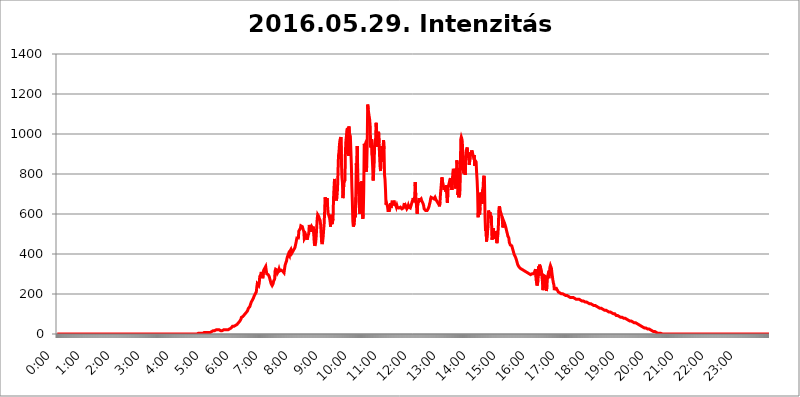
| Category | 2016.05.29. Intenzitás [W/m^2] |
|---|---|
| 0.0 | 0 |
| 0.0006944444444444445 | 0 |
| 0.001388888888888889 | 0 |
| 0.0020833333333333333 | 0 |
| 0.002777777777777778 | 0 |
| 0.003472222222222222 | 0 |
| 0.004166666666666667 | 0 |
| 0.004861111111111111 | 0 |
| 0.005555555555555556 | 0 |
| 0.0062499999999999995 | 0 |
| 0.006944444444444444 | 0 |
| 0.007638888888888889 | 0 |
| 0.008333333333333333 | 0 |
| 0.009027777777777779 | 0 |
| 0.009722222222222222 | 0 |
| 0.010416666666666666 | 0 |
| 0.011111111111111112 | 0 |
| 0.011805555555555555 | 0 |
| 0.012499999999999999 | 0 |
| 0.013194444444444444 | 0 |
| 0.013888888888888888 | 0 |
| 0.014583333333333332 | 0 |
| 0.015277777777777777 | 0 |
| 0.015972222222222224 | 0 |
| 0.016666666666666666 | 0 |
| 0.017361111111111112 | 0 |
| 0.018055555555555557 | 0 |
| 0.01875 | 0 |
| 0.019444444444444445 | 0 |
| 0.02013888888888889 | 0 |
| 0.020833333333333332 | 0 |
| 0.02152777777777778 | 0 |
| 0.022222222222222223 | 0 |
| 0.02291666666666667 | 0 |
| 0.02361111111111111 | 0 |
| 0.024305555555555556 | 0 |
| 0.024999999999999998 | 0 |
| 0.025694444444444447 | 0 |
| 0.02638888888888889 | 0 |
| 0.027083333333333334 | 0 |
| 0.027777777777777776 | 0 |
| 0.02847222222222222 | 0 |
| 0.029166666666666664 | 0 |
| 0.029861111111111113 | 0 |
| 0.030555555555555555 | 0 |
| 0.03125 | 0 |
| 0.03194444444444445 | 0 |
| 0.03263888888888889 | 0 |
| 0.03333333333333333 | 0 |
| 0.034027777777777775 | 0 |
| 0.034722222222222224 | 0 |
| 0.035416666666666666 | 0 |
| 0.036111111111111115 | 0 |
| 0.03680555555555556 | 0 |
| 0.0375 | 0 |
| 0.03819444444444444 | 0 |
| 0.03888888888888889 | 0 |
| 0.03958333333333333 | 0 |
| 0.04027777777777778 | 0 |
| 0.04097222222222222 | 0 |
| 0.041666666666666664 | 0 |
| 0.042361111111111106 | 0 |
| 0.04305555555555556 | 0 |
| 0.043750000000000004 | 0 |
| 0.044444444444444446 | 0 |
| 0.04513888888888889 | 0 |
| 0.04583333333333334 | 0 |
| 0.04652777777777778 | 0 |
| 0.04722222222222222 | 0 |
| 0.04791666666666666 | 0 |
| 0.04861111111111111 | 0 |
| 0.049305555555555554 | 0 |
| 0.049999999999999996 | 0 |
| 0.05069444444444445 | 0 |
| 0.051388888888888894 | 0 |
| 0.052083333333333336 | 0 |
| 0.05277777777777778 | 0 |
| 0.05347222222222222 | 0 |
| 0.05416666666666667 | 0 |
| 0.05486111111111111 | 0 |
| 0.05555555555555555 | 0 |
| 0.05625 | 0 |
| 0.05694444444444444 | 0 |
| 0.057638888888888885 | 0 |
| 0.05833333333333333 | 0 |
| 0.05902777777777778 | 0 |
| 0.059722222222222225 | 0 |
| 0.06041666666666667 | 0 |
| 0.061111111111111116 | 0 |
| 0.06180555555555556 | 0 |
| 0.0625 | 0 |
| 0.06319444444444444 | 0 |
| 0.06388888888888888 | 0 |
| 0.06458333333333334 | 0 |
| 0.06527777777777778 | 0 |
| 0.06597222222222222 | 0 |
| 0.06666666666666667 | 0 |
| 0.06736111111111111 | 0 |
| 0.06805555555555555 | 0 |
| 0.06874999999999999 | 0 |
| 0.06944444444444443 | 0 |
| 0.07013888888888889 | 0 |
| 0.07083333333333333 | 0 |
| 0.07152777777777779 | 0 |
| 0.07222222222222223 | 0 |
| 0.07291666666666667 | 0 |
| 0.07361111111111111 | 0 |
| 0.07430555555555556 | 0 |
| 0.075 | 0 |
| 0.07569444444444444 | 0 |
| 0.0763888888888889 | 0 |
| 0.07708333333333334 | 0 |
| 0.07777777777777778 | 0 |
| 0.07847222222222222 | 0 |
| 0.07916666666666666 | 0 |
| 0.0798611111111111 | 0 |
| 0.08055555555555556 | 0 |
| 0.08125 | 0 |
| 0.08194444444444444 | 0 |
| 0.08263888888888889 | 0 |
| 0.08333333333333333 | 0 |
| 0.08402777777777777 | 0 |
| 0.08472222222222221 | 0 |
| 0.08541666666666665 | 0 |
| 0.08611111111111112 | 0 |
| 0.08680555555555557 | 0 |
| 0.08750000000000001 | 0 |
| 0.08819444444444445 | 0 |
| 0.08888888888888889 | 0 |
| 0.08958333333333333 | 0 |
| 0.09027777777777778 | 0 |
| 0.09097222222222222 | 0 |
| 0.09166666666666667 | 0 |
| 0.09236111111111112 | 0 |
| 0.09305555555555556 | 0 |
| 0.09375 | 0 |
| 0.09444444444444444 | 0 |
| 0.09513888888888888 | 0 |
| 0.09583333333333333 | 0 |
| 0.09652777777777777 | 0 |
| 0.09722222222222222 | 0 |
| 0.09791666666666667 | 0 |
| 0.09861111111111111 | 0 |
| 0.09930555555555555 | 0 |
| 0.09999999999999999 | 0 |
| 0.10069444444444443 | 0 |
| 0.1013888888888889 | 0 |
| 0.10208333333333335 | 0 |
| 0.10277777777777779 | 0 |
| 0.10347222222222223 | 0 |
| 0.10416666666666667 | 0 |
| 0.10486111111111111 | 0 |
| 0.10555555555555556 | 0 |
| 0.10625 | 0 |
| 0.10694444444444444 | 0 |
| 0.1076388888888889 | 0 |
| 0.10833333333333334 | 0 |
| 0.10902777777777778 | 0 |
| 0.10972222222222222 | 0 |
| 0.1111111111111111 | 0 |
| 0.11180555555555556 | 0 |
| 0.11180555555555556 | 0 |
| 0.1125 | 0 |
| 0.11319444444444444 | 0 |
| 0.11388888888888889 | 0 |
| 0.11458333333333333 | 0 |
| 0.11527777777777777 | 0 |
| 0.11597222222222221 | 0 |
| 0.11666666666666665 | 0 |
| 0.1173611111111111 | 0 |
| 0.11805555555555557 | 0 |
| 0.11944444444444445 | 0 |
| 0.12013888888888889 | 0 |
| 0.12083333333333333 | 0 |
| 0.12152777777777778 | 0 |
| 0.12222222222222223 | 0 |
| 0.12291666666666667 | 0 |
| 0.12291666666666667 | 0 |
| 0.12361111111111112 | 0 |
| 0.12430555555555556 | 0 |
| 0.125 | 0 |
| 0.12569444444444444 | 0 |
| 0.12638888888888888 | 0 |
| 0.12708333333333333 | 0 |
| 0.16875 | 0 |
| 0.12847222222222224 | 0 |
| 0.12916666666666668 | 0 |
| 0.12986111111111112 | 0 |
| 0.13055555555555556 | 0 |
| 0.13125 | 0 |
| 0.13194444444444445 | 0 |
| 0.1326388888888889 | 0 |
| 0.13333333333333333 | 0 |
| 0.13402777777777777 | 0 |
| 0.13402777777777777 | 0 |
| 0.13472222222222222 | 0 |
| 0.13541666666666666 | 0 |
| 0.1361111111111111 | 0 |
| 0.13749999999999998 | 0 |
| 0.13819444444444443 | 0 |
| 0.1388888888888889 | 0 |
| 0.13958333333333334 | 0 |
| 0.14027777777777778 | 0 |
| 0.14097222222222222 | 0 |
| 0.14166666666666666 | 0 |
| 0.1423611111111111 | 0 |
| 0.14305555555555557 | 0 |
| 0.14375000000000002 | 0 |
| 0.14444444444444446 | 0 |
| 0.1451388888888889 | 0 |
| 0.1451388888888889 | 0 |
| 0.14652777777777778 | 0 |
| 0.14722222222222223 | 0 |
| 0.14791666666666667 | 0 |
| 0.1486111111111111 | 0 |
| 0.14930555555555555 | 0 |
| 0.15 | 0 |
| 0.15069444444444444 | 0 |
| 0.15138888888888888 | 0 |
| 0.15208333333333332 | 0 |
| 0.15277777777777776 | 0 |
| 0.15347222222222223 | 0 |
| 0.15416666666666667 | 0 |
| 0.15486111111111112 | 0 |
| 0.15555555555555556 | 0 |
| 0.15625 | 0 |
| 0.15694444444444444 | 0 |
| 0.15763888888888888 | 0 |
| 0.15833333333333333 | 0 |
| 0.15902777777777777 | 0 |
| 0.15972222222222224 | 0 |
| 0.16041666666666668 | 0 |
| 0.16111111111111112 | 0 |
| 0.16180555555555556 | 0 |
| 0.1625 | 0 |
| 0.16319444444444445 | 0 |
| 0.1638888888888889 | 0 |
| 0.16458333333333333 | 0 |
| 0.16527777777777777 | 0 |
| 0.16597222222222222 | 0 |
| 0.16666666666666666 | 0 |
| 0.1673611111111111 | 0 |
| 0.16805555555555554 | 0 |
| 0.16874999999999998 | 0 |
| 0.16944444444444443 | 0 |
| 0.17013888888888887 | 0 |
| 0.1708333333333333 | 0 |
| 0.17152777777777775 | 0 |
| 0.17222222222222225 | 0 |
| 0.1729166666666667 | 0 |
| 0.17361111111111113 | 0 |
| 0.17430555555555557 | 0 |
| 0.17500000000000002 | 0 |
| 0.17569444444444446 | 0 |
| 0.1763888888888889 | 0 |
| 0.17708333333333334 | 0 |
| 0.17777777777777778 | 0 |
| 0.17847222222222223 | 0 |
| 0.17916666666666667 | 0 |
| 0.1798611111111111 | 0 |
| 0.18055555555555555 | 0 |
| 0.18125 | 0 |
| 0.18194444444444444 | 0 |
| 0.1826388888888889 | 0 |
| 0.18333333333333335 | 0 |
| 0.1840277777777778 | 0 |
| 0.18472222222222223 | 0 |
| 0.18541666666666667 | 0 |
| 0.18611111111111112 | 0 |
| 0.18680555555555556 | 0 |
| 0.1875 | 0 |
| 0.18819444444444444 | 0 |
| 0.18888888888888888 | 0 |
| 0.18958333333333333 | 0 |
| 0.19027777777777777 | 0 |
| 0.1909722222222222 | 0 |
| 0.19166666666666665 | 0 |
| 0.19236111111111112 | 0 |
| 0.19305555555555554 | 0 |
| 0.19375 | 0 |
| 0.19444444444444445 | 0 |
| 0.1951388888888889 | 0 |
| 0.19583333333333333 | 0 |
| 0.19652777777777777 | 0 |
| 0.19722222222222222 | 3.525 |
| 0.19791666666666666 | 3.525 |
| 0.1986111111111111 | 3.525 |
| 0.19930555555555554 | 3.525 |
| 0.19999999999999998 | 3.525 |
| 0.20069444444444443 | 3.525 |
| 0.20138888888888887 | 3.525 |
| 0.2020833333333333 | 3.525 |
| 0.2027777777777778 | 3.525 |
| 0.2034722222222222 | 3.525 |
| 0.2041666666666667 | 3.525 |
| 0.20486111111111113 | 7.887 |
| 0.20555555555555557 | 7.887 |
| 0.20625000000000002 | 7.887 |
| 0.20694444444444446 | 7.887 |
| 0.2076388888888889 | 7.887 |
| 0.20833333333333334 | 7.887 |
| 0.20902777777777778 | 7.887 |
| 0.20972222222222223 | 7.887 |
| 0.21041666666666667 | 7.887 |
| 0.2111111111111111 | 7.887 |
| 0.21180555555555555 | 7.887 |
| 0.2125 | 7.887 |
| 0.21319444444444444 | 7.887 |
| 0.2138888888888889 | 7.887 |
| 0.21458333333333335 | 7.887 |
| 0.2152777777777778 | 12.257 |
| 0.21597222222222223 | 12.257 |
| 0.21666666666666667 | 12.257 |
| 0.21736111111111112 | 12.257 |
| 0.21805555555555556 | 12.257 |
| 0.21875 | 16.636 |
| 0.21944444444444444 | 16.636 |
| 0.22013888888888888 | 16.636 |
| 0.22083333333333333 | 16.636 |
| 0.22152777777777777 | 16.636 |
| 0.2222222222222222 | 21.024 |
| 0.22291666666666665 | 21.024 |
| 0.2236111111111111 | 21.024 |
| 0.22430555555555556 | 21.024 |
| 0.225 | 21.024 |
| 0.22569444444444445 | 16.636 |
| 0.2263888888888889 | 16.636 |
| 0.22708333333333333 | 21.024 |
| 0.22777777777777777 | 16.636 |
| 0.22847222222222222 | 16.636 |
| 0.22916666666666666 | 16.636 |
| 0.2298611111111111 | 16.636 |
| 0.23055555555555554 | 16.636 |
| 0.23124999999999998 | 16.636 |
| 0.23194444444444443 | 16.636 |
| 0.23263888888888887 | 21.024 |
| 0.2333333333333333 | 21.024 |
| 0.2340277777777778 | 21.024 |
| 0.2347222222222222 | 21.024 |
| 0.2354166666666667 | 21.024 |
| 0.23611111111111113 | 21.024 |
| 0.23680555555555557 | 21.024 |
| 0.23750000000000002 | 21.024 |
| 0.23819444444444446 | 21.024 |
| 0.2388888888888889 | 21.024 |
| 0.23958333333333334 | 21.024 |
| 0.24027777777777778 | 21.024 |
| 0.24097222222222223 | 21.024 |
| 0.24166666666666667 | 25.419 |
| 0.2423611111111111 | 25.419 |
| 0.24305555555555555 | 29.823 |
| 0.24375 | 29.823 |
| 0.24444444444444446 | 34.234 |
| 0.24513888888888888 | 34.234 |
| 0.24583333333333335 | 38.653 |
| 0.2465277777777778 | 38.653 |
| 0.24722222222222223 | 38.653 |
| 0.24791666666666667 | 38.653 |
| 0.24861111111111112 | 38.653 |
| 0.24930555555555556 | 43.079 |
| 0.25 | 43.079 |
| 0.25069444444444444 | 47.511 |
| 0.2513888888888889 | 47.511 |
| 0.2520833333333333 | 47.511 |
| 0.25277777777777777 | 51.951 |
| 0.2534722222222222 | 51.951 |
| 0.25416666666666665 | 56.398 |
| 0.2548611111111111 | 60.85 |
| 0.2555555555555556 | 60.85 |
| 0.25625000000000003 | 65.31 |
| 0.2569444444444445 | 69.775 |
| 0.2576388888888889 | 74.246 |
| 0.25833333333333336 | 83.205 |
| 0.2590277777777778 | 83.205 |
| 0.25972222222222224 | 87.692 |
| 0.2604166666666667 | 87.692 |
| 0.2611111111111111 | 92.184 |
| 0.26180555555555557 | 92.184 |
| 0.2625 | 96.682 |
| 0.26319444444444445 | 101.184 |
| 0.2638888888888889 | 101.184 |
| 0.26458333333333334 | 105.69 |
| 0.2652777777777778 | 110.201 |
| 0.2659722222222222 | 110.201 |
| 0.26666666666666666 | 114.716 |
| 0.2673611111111111 | 119.235 |
| 0.26805555555555555 | 128.284 |
| 0.26875 | 128.284 |
| 0.26944444444444443 | 132.814 |
| 0.2701388888888889 | 137.347 |
| 0.2708333333333333 | 146.423 |
| 0.27152777777777776 | 150.964 |
| 0.2722222222222222 | 160.056 |
| 0.27291666666666664 | 164.605 |
| 0.2736111111111111 | 169.156 |
| 0.2743055555555555 | 173.709 |
| 0.27499999999999997 | 178.264 |
| 0.27569444444444446 | 182.82 |
| 0.27638888888888885 | 191.937 |
| 0.27708333333333335 | 196.497 |
| 0.2777777777777778 | 201.058 |
| 0.27847222222222223 | 205.62 |
| 0.2791666666666667 | 210.182 |
| 0.2798611111111111 | 233 |
| 0.28055555555555556 | 251.251 |
| 0.28125 | 251.251 |
| 0.28194444444444444 | 251.251 |
| 0.2826388888888889 | 242.127 |
| 0.2833333333333333 | 255.813 |
| 0.28402777777777777 | 287.709 |
| 0.2847222222222222 | 292.259 |
| 0.28541666666666665 | 296.808 |
| 0.28611111111111115 | 310.44 |
| 0.28680555555555554 | 310.44 |
| 0.28750000000000003 | 292.259 |
| 0.2881944444444445 | 278.603 |
| 0.2888888888888889 | 283.156 |
| 0.28958333333333336 | 319.517 |
| 0.2902777777777778 | 324.052 |
| 0.29097222222222224 | 328.584 |
| 0.2916666666666667 | 333.113 |
| 0.2923611111111111 | 337.639 |
| 0.29305555555555557 | 333.113 |
| 0.29375 | 301.354 |
| 0.29444444444444445 | 301.354 |
| 0.2951388888888889 | 301.354 |
| 0.29583333333333334 | 296.808 |
| 0.2965277777777778 | 292.259 |
| 0.2972222222222222 | 287.709 |
| 0.29791666666666666 | 278.603 |
| 0.2986111111111111 | 269.49 |
| 0.29930555555555555 | 260.373 |
| 0.3 | 251.251 |
| 0.30069444444444443 | 246.689 |
| 0.3013888888888889 | 242.127 |
| 0.3020833333333333 | 242.127 |
| 0.30277777777777776 | 251.251 |
| 0.3034722222222222 | 264.932 |
| 0.30416666666666664 | 269.49 |
| 0.3048611111111111 | 274.047 |
| 0.3055555555555555 | 314.98 |
| 0.30624999999999997 | 324.052 |
| 0.3069444444444444 | 324.052 |
| 0.3076388888888889 | 324.052 |
| 0.30833333333333335 | 319.517 |
| 0.3090277777777778 | 305.898 |
| 0.30972222222222223 | 305.898 |
| 0.3104166666666667 | 314.98 |
| 0.3111111111111111 | 324.052 |
| 0.31180555555555556 | 314.98 |
| 0.3125 | 319.517 |
| 0.31319444444444444 | 319.517 |
| 0.3138888888888889 | 319.517 |
| 0.3145833333333333 | 324.052 |
| 0.31527777777777777 | 319.517 |
| 0.3159722222222222 | 314.98 |
| 0.31666666666666665 | 310.44 |
| 0.31736111111111115 | 319.517 |
| 0.31805555555555554 | 305.898 |
| 0.31875000000000003 | 324.052 |
| 0.3194444444444445 | 342.162 |
| 0.3201388888888889 | 351.198 |
| 0.32083333333333336 | 355.712 |
| 0.3215277777777778 | 364.728 |
| 0.32222222222222224 | 378.224 |
| 0.3229166666666667 | 387.202 |
| 0.3236111111111111 | 391.685 |
| 0.32430555555555557 | 400.638 |
| 0.325 | 405.108 |
| 0.32569444444444445 | 391.685 |
| 0.3263888888888889 | 414.035 |
| 0.32708333333333334 | 414.035 |
| 0.3277777777777778 | 422.943 |
| 0.3284722222222222 | 414.035 |
| 0.32916666666666666 | 405.108 |
| 0.3298611111111111 | 405.108 |
| 0.33055555555555555 | 414.035 |
| 0.33125 | 414.035 |
| 0.33194444444444443 | 422.943 |
| 0.3326388888888889 | 422.943 |
| 0.3333333333333333 | 431.833 |
| 0.3340277777777778 | 427.39 |
| 0.3347222222222222 | 453.968 |
| 0.3354166666666667 | 458.38 |
| 0.3361111111111111 | 480.356 |
| 0.3368055555555556 | 480.356 |
| 0.33749999999999997 | 480.356 |
| 0.33819444444444446 | 480.356 |
| 0.33888888888888885 | 515.223 |
| 0.33958333333333335 | 510.885 |
| 0.34027777777777773 | 515.223 |
| 0.34097222222222223 | 528.2 |
| 0.3416666666666666 | 541.121 |
| 0.3423611111111111 | 541.121 |
| 0.3430555555555555 | 541.121 |
| 0.34375 | 536.82 |
| 0.3444444444444445 | 536.82 |
| 0.3451388888888889 | 532.513 |
| 0.3458333333333334 | 510.885 |
| 0.34652777777777777 | 475.972 |
| 0.34722222222222227 | 475.972 |
| 0.34791666666666665 | 484.735 |
| 0.34861111111111115 | 493.475 |
| 0.34930555555555554 | 489.108 |
| 0.35000000000000003 | 489.108 |
| 0.3506944444444444 | 471.582 |
| 0.3513888888888889 | 489.108 |
| 0.3520833333333333 | 493.475 |
| 0.3527777777777778 | 502.192 |
| 0.3534722222222222 | 545.416 |
| 0.3541666666666667 | 545.416 |
| 0.3548611111111111 | 519.555 |
| 0.35555555555555557 | 510.885 |
| 0.35625 | 528.2 |
| 0.35694444444444445 | 536.82 |
| 0.3576388888888889 | 532.513 |
| 0.35833333333333334 | 528.2 |
| 0.3590277777777778 | 536.82 |
| 0.3597222222222222 | 502.192 |
| 0.36041666666666666 | 458.38 |
| 0.3611111111111111 | 440.702 |
| 0.36180555555555555 | 445.129 |
| 0.3625 | 458.38 |
| 0.36319444444444443 | 489.108 |
| 0.3638888888888889 | 532.513 |
| 0.3645833333333333 | 575.299 |
| 0.3652777777777778 | 596.45 |
| 0.3659722222222222 | 592.233 |
| 0.3666666666666667 | 588.009 |
| 0.3673611111111111 | 579.542 |
| 0.3680555555555556 | 575.299 |
| 0.36874999999999997 | 566.793 |
| 0.36944444444444446 | 545.416 |
| 0.37013888888888885 | 502.192 |
| 0.37083333333333335 | 458.38 |
| 0.37152777777777773 | 449.551 |
| 0.37222222222222223 | 462.786 |
| 0.3729166666666666 | 484.735 |
| 0.3736111111111111 | 519.555 |
| 0.3743055555555555 | 549.704 |
| 0.375 | 609.062 |
| 0.3756944444444445 | 683.473 |
| 0.3763888888888889 | 675.311 |
| 0.3770833333333334 | 675.311 |
| 0.37777777777777777 | 667.123 |
| 0.37847222222222227 | 679.395 |
| 0.37916666666666665 | 638.256 |
| 0.37986111111111115 | 604.864 |
| 0.38055555555555554 | 596.45 |
| 0.38125000000000003 | 588.009 |
| 0.3819444444444444 | 579.542 |
| 0.3826388888888889 | 562.53 |
| 0.3833333333333333 | 536.82 |
| 0.3840277777777778 | 596.45 |
| 0.3847222222222222 | 575.299 |
| 0.3854166666666667 | 549.704 |
| 0.3861111111111111 | 549.704 |
| 0.38680555555555557 | 575.299 |
| 0.3875 | 679.395 |
| 0.38819444444444445 | 731.896 |
| 0.3888888888888889 | 775.492 |
| 0.38958333333333334 | 739.877 |
| 0.3902777777777778 | 735.89 |
| 0.3909722222222222 | 703.762 |
| 0.39166666666666666 | 667.123 |
| 0.3923611111111111 | 703.762 |
| 0.39305555555555555 | 719.877 |
| 0.39375 | 810.641 |
| 0.39444444444444443 | 891.099 |
| 0.3951388888888889 | 909.996 |
| 0.3958333333333333 | 947.58 |
| 0.3965277777777778 | 970.034 |
| 0.3972222222222222 | 977.508 |
| 0.3979166666666667 | 984.98 |
| 0.3986111111111111 | 856.855 |
| 0.3993055555555556 | 783.342 |
| 0.39999999999999997 | 755.766 |
| 0.40069444444444446 | 679.395 |
| 0.40138888888888885 | 683.473 |
| 0.40208333333333335 | 759.723 |
| 0.40277777777777773 | 759.723 |
| 0.40347222222222223 | 767.62 |
| 0.4041666666666666 | 909.996 |
| 0.4048611111111111 | 966.295 |
| 0.4055555555555555 | 988.714 |
| 0.40625 | 1018.587 |
| 0.4069444444444445 | 1029.798 |
| 0.4076388888888889 | 981.244 |
| 0.4083333333333334 | 891.099 |
| 0.40902777777777777 | 1037.277 |
| 0.40972222222222227 | 1003.65 |
| 0.41041666666666665 | 996.182 |
| 0.41111111111111115 | 988.714 |
| 0.41180555555555554 | 917.534 |
| 0.41250000000000003 | 845.365 |
| 0.4131944444444444 | 735.89 |
| 0.4138888888888889 | 663.019 |
| 0.4145833333333333 | 562.53 |
| 0.4152777777777778 | 536.82 |
| 0.4159722222222222 | 541.121 |
| 0.4166666666666667 | 553.986 |
| 0.4173611111111111 | 629.948 |
| 0.41805555555555557 | 583.779 |
| 0.41875 | 683.473 |
| 0.41944444444444445 | 853.029 |
| 0.4201388888888889 | 802.868 |
| 0.42083333333333334 | 940.082 |
| 0.4215277777777778 | 751.803 |
| 0.4222222222222222 | 759.723 |
| 0.42291666666666666 | 699.717 |
| 0.4236111111111111 | 638.256 |
| 0.42430555555555555 | 600.661 |
| 0.425 | 600.661 |
| 0.42569444444444443 | 634.105 |
| 0.4263888888888889 | 658.909 |
| 0.4270833333333333 | 763.674 |
| 0.4277777777777778 | 629.948 |
| 0.4284722222222222 | 575.299 |
| 0.4291666666666667 | 596.45 |
| 0.4298611111111111 | 715.858 |
| 0.4305555555555556 | 951.327 |
| 0.43124999999999997 | 940.082 |
| 0.43194444444444446 | 947.58 |
| 0.43263888888888885 | 936.33 |
| 0.43333333333333335 | 810.641 |
| 0.43402777777777773 | 837.682 |
| 0.43472222222222223 | 943.832 |
| 0.4354166666666666 | 1147.086 |
| 0.4361111111111111 | 1124.056 |
| 0.4368055555555555 | 1105.019 |
| 0.4375 | 1105.019 |
| 0.4381944444444445 | 1071.027 |
| 0.4388888888888889 | 1037.277 |
| 0.4395833333333334 | 932.576 |
| 0.44027777777777777 | 936.33 |
| 0.44097222222222227 | 973.772 |
| 0.44166666666666665 | 891.099 |
| 0.44236111111111115 | 837.682 |
| 0.44305555555555554 | 767.62 |
| 0.44375000000000003 | 810.641 |
| 0.4444444444444444 | 853.029 |
| 0.4451388888888889 | 943.832 |
| 0.4458333333333333 | 962.555 |
| 0.4465277777777778 | 977.508 |
| 0.4472222222222222 | 1056.004 |
| 0.4479166666666667 | 1018.587 |
| 0.4486111111111111 | 955.071 |
| 0.44930555555555557 | 936.33 |
| 0.45 | 962.555 |
| 0.45069444444444445 | 1011.118 |
| 0.4513888888888889 | 955.071 |
| 0.45208333333333334 | 891.099 |
| 0.4527777777777778 | 837.682 |
| 0.4534722222222222 | 814.519 |
| 0.45416666666666666 | 917.534 |
| 0.4548611111111111 | 868.305 |
| 0.45555555555555555 | 940.082 |
| 0.45625 | 860.676 |
| 0.45694444444444443 | 925.06 |
| 0.4576388888888889 | 970.034 |
| 0.4583333333333333 | 925.06 |
| 0.4590277777777778 | 795.074 |
| 0.4597222222222222 | 771.559 |
| 0.4604166666666667 | 719.877 |
| 0.4611111111111111 | 646.537 |
| 0.4618055555555556 | 654.791 |
| 0.46249999999999997 | 646.537 |
| 0.46319444444444446 | 638.256 |
| 0.46388888888888885 | 617.436 |
| 0.46458333333333335 | 617.436 |
| 0.46527777777777773 | 617.436 |
| 0.46597222222222223 | 617.436 |
| 0.4666666666666666 | 634.105 |
| 0.4673611111111111 | 654.791 |
| 0.4680555555555555 | 629.948 |
| 0.46875 | 646.537 |
| 0.4694444444444445 | 658.909 |
| 0.4701388888888889 | 654.791 |
| 0.4708333333333334 | 658.909 |
| 0.47152777777777777 | 654.791 |
| 0.47222222222222227 | 667.123 |
| 0.47291666666666665 | 646.537 |
| 0.47361111111111115 | 642.4 |
| 0.47430555555555554 | 642.4 |
| 0.47500000000000003 | 642.4 |
| 0.4756944444444444 | 634.105 |
| 0.4763888888888889 | 642.4 |
| 0.4770833333333333 | 634.105 |
| 0.4777777777777778 | 638.256 |
| 0.4784722222222222 | 634.105 |
| 0.4791666666666667 | 629.948 |
| 0.4798611111111111 | 629.948 |
| 0.48055555555555557 | 625.784 |
| 0.48125 | 634.105 |
| 0.48194444444444445 | 629.948 |
| 0.4826388888888889 | 634.105 |
| 0.48333333333333334 | 625.784 |
| 0.4840277777777778 | 625.784 |
| 0.4847222222222222 | 629.948 |
| 0.48541666666666666 | 629.948 |
| 0.4861111111111111 | 642.4 |
| 0.48680555555555555 | 654.791 |
| 0.4875 | 642.4 |
| 0.48819444444444443 | 629.948 |
| 0.4888888888888889 | 638.256 |
| 0.4895833333333333 | 634.105 |
| 0.4902777777777778 | 625.784 |
| 0.4909722222222222 | 625.784 |
| 0.4916666666666667 | 634.105 |
| 0.4923611111111111 | 642.4 |
| 0.4930555555555556 | 634.105 |
| 0.49374999999999997 | 629.948 |
| 0.49444444444444446 | 634.105 |
| 0.49513888888888885 | 629.948 |
| 0.49583333333333335 | 629.948 |
| 0.49652777777777773 | 646.537 |
| 0.49722222222222223 | 654.791 |
| 0.4979166666666666 | 650.667 |
| 0.4986111111111111 | 654.791 |
| 0.4993055555555555 | 679.395 |
| 0.5 | 658.909 |
| 0.5006944444444444 | 667.123 |
| 0.5013888888888889 | 691.608 |
| 0.5020833333333333 | 759.723 |
| 0.5027777777777778 | 691.608 |
| 0.5034722222222222 | 658.909 |
| 0.5041666666666667 | 625.784 |
| 0.5048611111111111 | 600.661 |
| 0.5055555555555555 | 650.667 |
| 0.50625 | 654.791 |
| 0.5069444444444444 | 667.123 |
| 0.5076388888888889 | 679.395 |
| 0.5083333333333333 | 667.123 |
| 0.5090277777777777 | 667.123 |
| 0.5097222222222222 | 671.22 |
| 0.5104166666666666 | 675.311 |
| 0.5111111111111112 | 667.123 |
| 0.5118055555555555 | 667.123 |
| 0.5125000000000001 | 663.019 |
| 0.5131944444444444 | 650.667 |
| 0.513888888888889 | 642.4 |
| 0.5145833333333333 | 625.784 |
| 0.5152777777777778 | 621.613 |
| 0.5159722222222222 | 621.613 |
| 0.5166666666666667 | 617.436 |
| 0.517361111111111 | 617.436 |
| 0.5180555555555556 | 617.436 |
| 0.5187499999999999 | 617.436 |
| 0.5194444444444445 | 621.613 |
| 0.5201388888888888 | 625.784 |
| 0.5208333333333334 | 629.948 |
| 0.5215277777777778 | 638.256 |
| 0.5222222222222223 | 650.667 |
| 0.5229166666666667 | 658.909 |
| 0.5236111111111111 | 675.311 |
| 0.5243055555555556 | 683.473 |
| 0.525 | 679.395 |
| 0.5256944444444445 | 683.473 |
| 0.5263888888888889 | 679.395 |
| 0.5270833333333333 | 675.311 |
| 0.5277777777777778 | 675.311 |
| 0.5284722222222222 | 675.311 |
| 0.5291666666666667 | 679.395 |
| 0.5298611111111111 | 683.473 |
| 0.5305555555555556 | 683.473 |
| 0.53125 | 671.22 |
| 0.5319444444444444 | 675.311 |
| 0.5326388888888889 | 671.22 |
| 0.5333333333333333 | 658.909 |
| 0.5340277777777778 | 658.909 |
| 0.5347222222222222 | 658.909 |
| 0.5354166666666667 | 646.537 |
| 0.5361111111111111 | 638.256 |
| 0.5368055555555555 | 658.909 |
| 0.5375 | 699.717 |
| 0.5381944444444444 | 703.762 |
| 0.5388888888888889 | 759.723 |
| 0.5395833333333333 | 783.342 |
| 0.5402777777777777 | 763.674 |
| 0.5409722222222222 | 751.803 |
| 0.5416666666666666 | 739.877 |
| 0.5423611111111112 | 719.877 |
| 0.5430555555555555 | 727.896 |
| 0.5437500000000001 | 735.89 |
| 0.5444444444444444 | 731.896 |
| 0.545138888888889 | 711.832 |
| 0.5458333333333333 | 743.859 |
| 0.5465277777777778 | 743.859 |
| 0.5472222222222222 | 654.791 |
| 0.5479166666666667 | 723.889 |
| 0.548611111111111 | 739.877 |
| 0.5493055555555556 | 743.859 |
| 0.5499999999999999 | 759.723 |
| 0.5506944444444445 | 771.559 |
| 0.5513888888888888 | 779.42 |
| 0.5520833333333334 | 735.89 |
| 0.5527777777777778 | 759.723 |
| 0.5534722222222223 | 719.877 |
| 0.5541666666666667 | 767.62 |
| 0.5548611111111111 | 806.757 |
| 0.5555555555555556 | 826.123 |
| 0.55625 | 810.641 |
| 0.5569444444444445 | 755.766 |
| 0.5576388888888889 | 771.559 |
| 0.5583333333333333 | 727.896 |
| 0.5590277777777778 | 731.896 |
| 0.5597222222222222 | 775.492 |
| 0.5604166666666667 | 868.305 |
| 0.5611111111111111 | 849.199 |
| 0.5618055555555556 | 695.666 |
| 0.5625 | 711.832 |
| 0.5631944444444444 | 683.473 |
| 0.5638888888888889 | 683.473 |
| 0.5645833333333333 | 699.717 |
| 0.5652777777777778 | 783.342 |
| 0.5659722222222222 | 973.772 |
| 0.5666666666666667 | 984.98 |
| 0.5673611111111111 | 977.508 |
| 0.5680555555555555 | 962.555 |
| 0.56875 | 906.223 |
| 0.5694444444444444 | 837.682 |
| 0.5701388888888889 | 802.868 |
| 0.5708333333333333 | 837.682 |
| 0.5715277777777777 | 829.981 |
| 0.5722222222222222 | 795.074 |
| 0.5729166666666666 | 891.099 |
| 0.5736111111111112 | 913.766 |
| 0.5743055555555555 | 925.06 |
| 0.5750000000000001 | 932.576 |
| 0.5756944444444444 | 894.885 |
| 0.576388888888889 | 887.309 |
| 0.5770833333333333 | 879.719 |
| 0.5777777777777778 | 845.365 |
| 0.5784722222222222 | 864.493 |
| 0.5791666666666667 | 875.918 |
| 0.579861111111111 | 909.996 |
| 0.5805555555555556 | 902.447 |
| 0.5812499999999999 | 917.534 |
| 0.5819444444444445 | 913.766 |
| 0.5826388888888888 | 902.447 |
| 0.5833333333333334 | 891.099 |
| 0.5840277777777778 | 883.516 |
| 0.5847222222222223 | 894.885 |
| 0.5854166666666667 | 841.526 |
| 0.5861111111111111 | 868.305 |
| 0.5868055555555556 | 872.114 |
| 0.5875 | 860.676 |
| 0.5881944444444445 | 806.757 |
| 0.5888888888888889 | 767.62 |
| 0.5895833333333333 | 707.8 |
| 0.5902777777777778 | 583.779 |
| 0.5909722222222222 | 625.784 |
| 0.5916666666666667 | 609.062 |
| 0.5923611111111111 | 596.45 |
| 0.5930555555555556 | 634.105 |
| 0.59375 | 707.8 |
| 0.5944444444444444 | 711.832 |
| 0.5951388888888889 | 695.666 |
| 0.5958333333333333 | 650.667 |
| 0.5965277777777778 | 719.877 |
| 0.5972222222222222 | 727.896 |
| 0.5979166666666667 | 779.42 |
| 0.5986111111111111 | 791.169 |
| 0.5993055555555555 | 747.834 |
| 0.6 | 583.779 |
| 0.6006944444444444 | 515.223 |
| 0.6013888888888889 | 541.121 |
| 0.6020833333333333 | 462.786 |
| 0.6027777777777777 | 467.187 |
| 0.6034722222222222 | 515.223 |
| 0.6041666666666666 | 536.82 |
| 0.6048611111111112 | 617.436 |
| 0.6055555555555555 | 609.062 |
| 0.6062500000000001 | 600.661 |
| 0.6069444444444444 | 609.062 |
| 0.607638888888889 | 583.779 |
| 0.6083333333333333 | 592.233 |
| 0.6090277777777778 | 571.049 |
| 0.6097222222222222 | 471.582 |
| 0.6104166666666667 | 475.972 |
| 0.611111111111111 | 497.836 |
| 0.6118055555555556 | 528.2 |
| 0.6124999999999999 | 475.972 |
| 0.6131944444444445 | 502.192 |
| 0.6138888888888888 | 506.542 |
| 0.6145833333333334 | 515.223 |
| 0.6152777777777778 | 515.223 |
| 0.6159722222222223 | 471.582 |
| 0.6166666666666667 | 453.968 |
| 0.6173611111111111 | 475.972 |
| 0.6180555555555556 | 497.836 |
| 0.61875 | 545.416 |
| 0.6194444444444445 | 625.784 |
| 0.6201388888888889 | 638.256 |
| 0.6208333333333333 | 625.784 |
| 0.6215277777777778 | 613.252 |
| 0.6222222222222222 | 604.864 |
| 0.6229166666666667 | 596.45 |
| 0.6236111111111111 | 588.009 |
| 0.6243055555555556 | 566.793 |
| 0.625 | 532.513 |
| 0.6256944444444444 | 532.513 |
| 0.6263888888888889 | 562.53 |
| 0.6270833333333333 | 558.261 |
| 0.6277777777777778 | 549.704 |
| 0.6284722222222222 | 541.121 |
| 0.6291666666666667 | 532.513 |
| 0.6298611111111111 | 528.2 |
| 0.6305555555555555 | 510.885 |
| 0.63125 | 502.192 |
| 0.6319444444444444 | 489.108 |
| 0.6326388888888889 | 489.108 |
| 0.6333333333333333 | 480.356 |
| 0.6340277777777777 | 458.38 |
| 0.6347222222222222 | 453.968 |
| 0.6354166666666666 | 445.129 |
| 0.6361111111111112 | 449.551 |
| 0.6368055555555555 | 449.551 |
| 0.6375000000000001 | 440.702 |
| 0.6381944444444444 | 431.833 |
| 0.638888888888889 | 422.943 |
| 0.6395833333333333 | 414.035 |
| 0.6402777777777778 | 405.108 |
| 0.6409722222222222 | 396.164 |
| 0.6416666666666667 | 391.685 |
| 0.642361111111111 | 387.202 |
| 0.6430555555555556 | 382.715 |
| 0.6437499999999999 | 373.729 |
| 0.6444444444444445 | 364.728 |
| 0.6451388888888888 | 355.712 |
| 0.6458333333333334 | 346.682 |
| 0.6465277777777778 | 342.162 |
| 0.6472222222222223 | 337.639 |
| 0.6479166666666667 | 333.113 |
| 0.6486111111111111 | 333.113 |
| 0.6493055555555556 | 328.584 |
| 0.65 | 328.584 |
| 0.6506944444444445 | 324.052 |
| 0.6513888888888889 | 324.052 |
| 0.6520833333333333 | 324.052 |
| 0.6527777777777778 | 319.517 |
| 0.6534722222222222 | 319.517 |
| 0.6541666666666667 | 319.517 |
| 0.6548611111111111 | 314.98 |
| 0.6555555555555556 | 314.98 |
| 0.65625 | 314.98 |
| 0.6569444444444444 | 310.44 |
| 0.6576388888888889 | 310.44 |
| 0.6583333333333333 | 310.44 |
| 0.6590277777777778 | 310.44 |
| 0.6597222222222222 | 305.898 |
| 0.6604166666666667 | 305.898 |
| 0.6611111111111111 | 301.354 |
| 0.6618055555555555 | 301.354 |
| 0.6625 | 301.354 |
| 0.6631944444444444 | 296.808 |
| 0.6638888888888889 | 296.808 |
| 0.6645833333333333 | 301.354 |
| 0.6652777777777777 | 301.354 |
| 0.6659722222222222 | 301.354 |
| 0.6666666666666666 | 301.354 |
| 0.6673611111111111 | 301.354 |
| 0.6680555555555556 | 301.354 |
| 0.6687500000000001 | 305.898 |
| 0.6694444444444444 | 310.44 |
| 0.6701388888888888 | 314.98 |
| 0.6708333333333334 | 324.052 |
| 0.6715277777777778 | 319.517 |
| 0.6722222222222222 | 255.813 |
| 0.6729166666666666 | 242.127 |
| 0.6736111111111112 | 251.251 |
| 0.6743055555555556 | 264.932 |
| 0.6749999999999999 | 337.639 |
| 0.6756944444444444 | 292.259 |
| 0.6763888888888889 | 346.682 |
| 0.6770833333333334 | 342.162 |
| 0.6777777777777777 | 333.113 |
| 0.6784722222222223 | 324.052 |
| 0.6791666666666667 | 314.98 |
| 0.6798611111111111 | 283.156 |
| 0.6805555555555555 | 260.373 |
| 0.68125 | 219.309 |
| 0.6819444444444445 | 223.873 |
| 0.6826388888888889 | 292.259 |
| 0.6833333333333332 | 292.259 |
| 0.6840277777777778 | 287.709 |
| 0.6847222222222222 | 287.709 |
| 0.6854166666666667 | 283.156 |
| 0.686111111111111 | 214.746 |
| 0.6868055555555556 | 242.127 |
| 0.6875 | 278.603 |
| 0.6881944444444444 | 292.259 |
| 0.688888888888889 | 296.808 |
| 0.6895833333333333 | 278.603 |
| 0.6902777777777778 | 310.44 |
| 0.6909722222222222 | 333.113 |
| 0.6916666666666668 | 342.162 |
| 0.6923611111111111 | 342.162 |
| 0.6930555555555555 | 328.584 |
| 0.69375 | 305.898 |
| 0.6944444444444445 | 287.709 |
| 0.6951388888888889 | 269.49 |
| 0.6958333333333333 | 255.813 |
| 0.6965277777777777 | 246.689 |
| 0.6972222222222223 | 219.309 |
| 0.6979166666666666 | 228.436 |
| 0.6986111111111111 | 233 |
| 0.6993055555555556 | 228.436 |
| 0.7000000000000001 | 228.436 |
| 0.7006944444444444 | 223.873 |
| 0.7013888888888888 | 219.309 |
| 0.7020833333333334 | 214.746 |
| 0.7027777777777778 | 210.182 |
| 0.7034722222222222 | 210.182 |
| 0.7041666666666666 | 205.62 |
| 0.7048611111111112 | 205.62 |
| 0.7055555555555556 | 205.62 |
| 0.7062499999999999 | 201.058 |
| 0.7069444444444444 | 201.058 |
| 0.7076388888888889 | 201.058 |
| 0.7083333333333334 | 201.058 |
| 0.7090277777777777 | 201.058 |
| 0.7097222222222223 | 201.058 |
| 0.7104166666666667 | 201.058 |
| 0.7111111111111111 | 196.497 |
| 0.7118055555555555 | 196.497 |
| 0.7125 | 191.937 |
| 0.7131944444444445 | 191.937 |
| 0.7138888888888889 | 191.937 |
| 0.7145833333333332 | 191.937 |
| 0.7152777777777778 | 191.937 |
| 0.7159722222222222 | 191.937 |
| 0.7166666666666667 | 191.937 |
| 0.717361111111111 | 187.378 |
| 0.7180555555555556 | 187.378 |
| 0.71875 | 187.378 |
| 0.7194444444444444 | 182.82 |
| 0.720138888888889 | 182.82 |
| 0.7208333333333333 | 182.82 |
| 0.7215277777777778 | 182.82 |
| 0.7222222222222222 | 182.82 |
| 0.7229166666666668 | 182.82 |
| 0.7236111111111111 | 182.82 |
| 0.7243055555555555 | 178.264 |
| 0.725 | 178.264 |
| 0.7256944444444445 | 178.264 |
| 0.7263888888888889 | 178.264 |
| 0.7270833333333333 | 178.264 |
| 0.7277777777777777 | 173.709 |
| 0.7284722222222223 | 173.709 |
| 0.7291666666666666 | 173.709 |
| 0.7298611111111111 | 173.709 |
| 0.7305555555555556 | 173.709 |
| 0.7312500000000001 | 173.709 |
| 0.7319444444444444 | 173.709 |
| 0.7326388888888888 | 173.709 |
| 0.7333333333333334 | 169.156 |
| 0.7340277777777778 | 169.156 |
| 0.7347222222222222 | 169.156 |
| 0.7354166666666666 | 169.156 |
| 0.7361111111111112 | 164.605 |
| 0.7368055555555556 | 164.605 |
| 0.7374999999999999 | 164.605 |
| 0.7381944444444444 | 164.605 |
| 0.7388888888888889 | 164.605 |
| 0.7395833333333334 | 164.605 |
| 0.7402777777777777 | 160.056 |
| 0.7409722222222223 | 160.056 |
| 0.7416666666666667 | 160.056 |
| 0.7423611111111111 | 160.056 |
| 0.7430555555555555 | 155.509 |
| 0.74375 | 155.509 |
| 0.7444444444444445 | 155.509 |
| 0.7451388888888889 | 155.509 |
| 0.7458333333333332 | 155.509 |
| 0.7465277777777778 | 150.964 |
| 0.7472222222222222 | 150.964 |
| 0.7479166666666667 | 150.964 |
| 0.748611111111111 | 150.964 |
| 0.7493055555555556 | 146.423 |
| 0.75 | 146.423 |
| 0.7506944444444444 | 146.423 |
| 0.751388888888889 | 146.423 |
| 0.7520833333333333 | 146.423 |
| 0.7527777777777778 | 141.884 |
| 0.7534722222222222 | 141.884 |
| 0.7541666666666668 | 141.884 |
| 0.7548611111111111 | 141.884 |
| 0.7555555555555555 | 141.884 |
| 0.75625 | 137.347 |
| 0.7569444444444445 | 137.347 |
| 0.7576388888888889 | 137.347 |
| 0.7583333333333333 | 137.347 |
| 0.7590277777777777 | 132.814 |
| 0.7597222222222223 | 132.814 |
| 0.7604166666666666 | 132.814 |
| 0.7611111111111111 | 128.284 |
| 0.7618055555555556 | 128.284 |
| 0.7625000000000001 | 128.284 |
| 0.7631944444444444 | 128.284 |
| 0.7638888888888888 | 123.758 |
| 0.7645833333333334 | 123.758 |
| 0.7652777777777778 | 123.758 |
| 0.7659722222222222 | 123.758 |
| 0.7666666666666666 | 119.235 |
| 0.7673611111111112 | 119.235 |
| 0.7680555555555556 | 123.758 |
| 0.7687499999999999 | 123.758 |
| 0.7694444444444444 | 119.235 |
| 0.7701388888888889 | 114.716 |
| 0.7708333333333334 | 114.716 |
| 0.7715277777777777 | 114.716 |
| 0.7722222222222223 | 114.716 |
| 0.7729166666666667 | 114.716 |
| 0.7736111111111111 | 110.201 |
| 0.7743055555555555 | 110.201 |
| 0.775 | 110.201 |
| 0.7756944444444445 | 110.201 |
| 0.7763888888888889 | 110.201 |
| 0.7770833333333332 | 105.69 |
| 0.7777777777777778 | 105.69 |
| 0.7784722222222222 | 105.69 |
| 0.7791666666666667 | 105.69 |
| 0.779861111111111 | 101.184 |
| 0.7805555555555556 | 101.184 |
| 0.78125 | 101.184 |
| 0.7819444444444444 | 101.184 |
| 0.782638888888889 | 96.682 |
| 0.7833333333333333 | 96.682 |
| 0.7840277777777778 | 92.184 |
| 0.7847222222222222 | 92.184 |
| 0.7854166666666668 | 92.184 |
| 0.7861111111111111 | 92.184 |
| 0.7868055555555555 | 87.692 |
| 0.7875 | 87.692 |
| 0.7881944444444445 | 87.692 |
| 0.7888888888888889 | 83.205 |
| 0.7895833333333333 | 83.205 |
| 0.7902777777777777 | 83.205 |
| 0.7909722222222223 | 83.205 |
| 0.7916666666666666 | 83.205 |
| 0.7923611111111111 | 83.205 |
| 0.7930555555555556 | 83.205 |
| 0.7937500000000001 | 78.722 |
| 0.7944444444444444 | 78.722 |
| 0.7951388888888888 | 78.722 |
| 0.7958333333333334 | 78.722 |
| 0.7965277777777778 | 78.722 |
| 0.7972222222222222 | 74.246 |
| 0.7979166666666666 | 74.246 |
| 0.7986111111111112 | 74.246 |
| 0.7993055555555556 | 74.246 |
| 0.7999999999999999 | 74.246 |
| 0.8006944444444444 | 69.775 |
| 0.8013888888888889 | 69.775 |
| 0.8020833333333334 | 69.775 |
| 0.8027777777777777 | 65.31 |
| 0.8034722222222223 | 65.31 |
| 0.8041666666666667 | 65.31 |
| 0.8048611111111111 | 65.31 |
| 0.8055555555555555 | 65.31 |
| 0.80625 | 65.31 |
| 0.8069444444444445 | 60.85 |
| 0.8076388888888889 | 60.85 |
| 0.8083333333333332 | 56.398 |
| 0.8090277777777778 | 56.398 |
| 0.8097222222222222 | 56.398 |
| 0.8104166666666667 | 56.398 |
| 0.811111111111111 | 56.398 |
| 0.8118055555555556 | 51.951 |
| 0.8125 | 51.951 |
| 0.8131944444444444 | 51.951 |
| 0.813888888888889 | 47.511 |
| 0.8145833333333333 | 47.511 |
| 0.8152777777777778 | 47.511 |
| 0.8159722222222222 | 43.079 |
| 0.8166666666666668 | 43.079 |
| 0.8173611111111111 | 43.079 |
| 0.8180555555555555 | 43.079 |
| 0.81875 | 38.653 |
| 0.8194444444444445 | 38.653 |
| 0.8201388888888889 | 38.653 |
| 0.8208333333333333 | 34.234 |
| 0.8215277777777777 | 34.234 |
| 0.8222222222222223 | 34.234 |
| 0.8229166666666666 | 34.234 |
| 0.8236111111111111 | 29.823 |
| 0.8243055555555556 | 29.823 |
| 0.8250000000000001 | 29.823 |
| 0.8256944444444444 | 29.823 |
| 0.8263888888888888 | 29.823 |
| 0.8270833333333334 | 25.419 |
| 0.8277777777777778 | 25.419 |
| 0.8284722222222222 | 25.419 |
| 0.8291666666666666 | 25.419 |
| 0.8298611111111112 | 25.419 |
| 0.8305555555555556 | 21.024 |
| 0.8312499999999999 | 21.024 |
| 0.8319444444444444 | 21.024 |
| 0.8326388888888889 | 21.024 |
| 0.8333333333333334 | 16.636 |
| 0.8340277777777777 | 16.636 |
| 0.8347222222222223 | 16.636 |
| 0.8354166666666667 | 12.257 |
| 0.8361111111111111 | 12.257 |
| 0.8368055555555555 | 12.257 |
| 0.8375 | 12.257 |
| 0.8381944444444445 | 12.257 |
| 0.8388888888888889 | 12.257 |
| 0.8395833333333332 | 7.887 |
| 0.8402777777777778 | 7.887 |
| 0.8409722222222222 | 7.887 |
| 0.8416666666666667 | 7.887 |
| 0.842361111111111 | 3.525 |
| 0.8430555555555556 | 3.525 |
| 0.84375 | 3.525 |
| 0.8444444444444444 | 3.525 |
| 0.845138888888889 | 3.525 |
| 0.8458333333333333 | 3.525 |
| 0.8465277777777778 | 3.525 |
| 0.8472222222222222 | 3.525 |
| 0.8479166666666668 | 0 |
| 0.8486111111111111 | 0 |
| 0.8493055555555555 | 0 |
| 0.85 | 0 |
| 0.8506944444444445 | 0 |
| 0.8513888888888889 | 0 |
| 0.8520833333333333 | 0 |
| 0.8527777777777777 | 0 |
| 0.8534722222222223 | 0 |
| 0.8541666666666666 | 0 |
| 0.8548611111111111 | 0 |
| 0.8555555555555556 | 0 |
| 0.8562500000000001 | 0 |
| 0.8569444444444444 | 0 |
| 0.8576388888888888 | 0 |
| 0.8583333333333334 | 0 |
| 0.8590277777777778 | 0 |
| 0.8597222222222222 | 0 |
| 0.8604166666666666 | 0 |
| 0.8611111111111112 | 0 |
| 0.8618055555555556 | 0 |
| 0.8624999999999999 | 0 |
| 0.8631944444444444 | 0 |
| 0.8638888888888889 | 0 |
| 0.8645833333333334 | 0 |
| 0.8652777777777777 | 0 |
| 0.8659722222222223 | 0 |
| 0.8666666666666667 | 0 |
| 0.8673611111111111 | 0 |
| 0.8680555555555555 | 0 |
| 0.86875 | 0 |
| 0.8694444444444445 | 0 |
| 0.8701388888888889 | 0 |
| 0.8708333333333332 | 0 |
| 0.8715277777777778 | 0 |
| 0.8722222222222222 | 0 |
| 0.8729166666666667 | 0 |
| 0.873611111111111 | 0 |
| 0.8743055555555556 | 0 |
| 0.875 | 0 |
| 0.8756944444444444 | 0 |
| 0.876388888888889 | 0 |
| 0.8770833333333333 | 0 |
| 0.8777777777777778 | 0 |
| 0.8784722222222222 | 0 |
| 0.8791666666666668 | 0 |
| 0.8798611111111111 | 0 |
| 0.8805555555555555 | 0 |
| 0.88125 | 0 |
| 0.8819444444444445 | 0 |
| 0.8826388888888889 | 0 |
| 0.8833333333333333 | 0 |
| 0.8840277777777777 | 0 |
| 0.8847222222222223 | 0 |
| 0.8854166666666666 | 0 |
| 0.8861111111111111 | 0 |
| 0.8868055555555556 | 0 |
| 0.8875000000000001 | 0 |
| 0.8881944444444444 | 0 |
| 0.8888888888888888 | 0 |
| 0.8895833333333334 | 0 |
| 0.8902777777777778 | 0 |
| 0.8909722222222222 | 0 |
| 0.8916666666666666 | 0 |
| 0.8923611111111112 | 0 |
| 0.8930555555555556 | 0 |
| 0.8937499999999999 | 0 |
| 0.8944444444444444 | 0 |
| 0.8951388888888889 | 0 |
| 0.8958333333333334 | 0 |
| 0.8965277777777777 | 0 |
| 0.8972222222222223 | 0 |
| 0.8979166666666667 | 0 |
| 0.8986111111111111 | 0 |
| 0.8993055555555555 | 0 |
| 0.9 | 0 |
| 0.9006944444444445 | 0 |
| 0.9013888888888889 | 0 |
| 0.9020833333333332 | 0 |
| 0.9027777777777778 | 0 |
| 0.9034722222222222 | 0 |
| 0.9041666666666667 | 0 |
| 0.904861111111111 | 0 |
| 0.9055555555555556 | 0 |
| 0.90625 | 0 |
| 0.9069444444444444 | 0 |
| 0.907638888888889 | 0 |
| 0.9083333333333333 | 0 |
| 0.9090277777777778 | 0 |
| 0.9097222222222222 | 0 |
| 0.9104166666666668 | 0 |
| 0.9111111111111111 | 0 |
| 0.9118055555555555 | 0 |
| 0.9125 | 0 |
| 0.9131944444444445 | 0 |
| 0.9138888888888889 | 0 |
| 0.9145833333333333 | 0 |
| 0.9152777777777777 | 0 |
| 0.9159722222222223 | 0 |
| 0.9166666666666666 | 0 |
| 0.9173611111111111 | 0 |
| 0.9180555555555556 | 0 |
| 0.9187500000000001 | 0 |
| 0.9194444444444444 | 0 |
| 0.9201388888888888 | 0 |
| 0.9208333333333334 | 0 |
| 0.9215277777777778 | 0 |
| 0.9222222222222222 | 0 |
| 0.9229166666666666 | 0 |
| 0.9236111111111112 | 0 |
| 0.9243055555555556 | 0 |
| 0.9249999999999999 | 0 |
| 0.9256944444444444 | 0 |
| 0.9263888888888889 | 0 |
| 0.9270833333333334 | 0 |
| 0.9277777777777777 | 0 |
| 0.9284722222222223 | 0 |
| 0.9291666666666667 | 0 |
| 0.9298611111111111 | 0 |
| 0.9305555555555555 | 0 |
| 0.93125 | 0 |
| 0.9319444444444445 | 0 |
| 0.9326388888888889 | 0 |
| 0.9333333333333332 | 0 |
| 0.9340277777777778 | 0 |
| 0.9347222222222222 | 0 |
| 0.9354166666666667 | 0 |
| 0.936111111111111 | 0 |
| 0.9368055555555556 | 0 |
| 0.9375 | 0 |
| 0.9381944444444444 | 0 |
| 0.938888888888889 | 0 |
| 0.9395833333333333 | 0 |
| 0.9402777777777778 | 0 |
| 0.9409722222222222 | 0 |
| 0.9416666666666668 | 0 |
| 0.9423611111111111 | 0 |
| 0.9430555555555555 | 0 |
| 0.94375 | 0 |
| 0.9444444444444445 | 0 |
| 0.9451388888888889 | 0 |
| 0.9458333333333333 | 0 |
| 0.9465277777777777 | 0 |
| 0.9472222222222223 | 0 |
| 0.9479166666666666 | 0 |
| 0.9486111111111111 | 0 |
| 0.9493055555555556 | 0 |
| 0.9500000000000001 | 0 |
| 0.9506944444444444 | 0 |
| 0.9513888888888888 | 0 |
| 0.9520833333333334 | 0 |
| 0.9527777777777778 | 0 |
| 0.9534722222222222 | 0 |
| 0.9541666666666666 | 0 |
| 0.9548611111111112 | 0 |
| 0.9555555555555556 | 0 |
| 0.9562499999999999 | 0 |
| 0.9569444444444444 | 0 |
| 0.9576388888888889 | 0 |
| 0.9583333333333334 | 0 |
| 0.9590277777777777 | 0 |
| 0.9597222222222223 | 0 |
| 0.9604166666666667 | 0 |
| 0.9611111111111111 | 0 |
| 0.9618055555555555 | 0 |
| 0.9625 | 0 |
| 0.9631944444444445 | 0 |
| 0.9638888888888889 | 0 |
| 0.9645833333333332 | 0 |
| 0.9652777777777778 | 0 |
| 0.9659722222222222 | 0 |
| 0.9666666666666667 | 0 |
| 0.967361111111111 | 0 |
| 0.9680555555555556 | 0 |
| 0.96875 | 0 |
| 0.9694444444444444 | 0 |
| 0.970138888888889 | 0 |
| 0.9708333333333333 | 0 |
| 0.9715277777777778 | 0 |
| 0.9722222222222222 | 0 |
| 0.9729166666666668 | 0 |
| 0.9736111111111111 | 0 |
| 0.9743055555555555 | 0 |
| 0.975 | 0 |
| 0.9756944444444445 | 0 |
| 0.9763888888888889 | 0 |
| 0.9770833333333333 | 0 |
| 0.9777777777777777 | 0 |
| 0.9784722222222223 | 0 |
| 0.9791666666666666 | 0 |
| 0.9798611111111111 | 0 |
| 0.9805555555555556 | 0 |
| 0.9812500000000001 | 0 |
| 0.9819444444444444 | 0 |
| 0.9826388888888888 | 0 |
| 0.9833333333333334 | 0 |
| 0.9840277777777778 | 0 |
| 0.9847222222222222 | 0 |
| 0.9854166666666666 | 0 |
| 0.9861111111111112 | 0 |
| 0.9868055555555556 | 0 |
| 0.9874999999999999 | 0 |
| 0.9881944444444444 | 0 |
| 0.9888888888888889 | 0 |
| 0.9895833333333334 | 0 |
| 0.9902777777777777 | 0 |
| 0.9909722222222223 | 0 |
| 0.9916666666666667 | 0 |
| 0.9923611111111111 | 0 |
| 0.9930555555555555 | 0 |
| 0.99375 | 0 |
| 0.9944444444444445 | 0 |
| 0.9951388888888889 | 0 |
| 0.9958333333333332 | 0 |
| 0.9965277777777778 | 0 |
| 0.9972222222222222 | 0 |
| 0.9979166666666667 | 0 |
| 0.998611111111111 | 0 |
| 0.9993055555555556 | 0 |